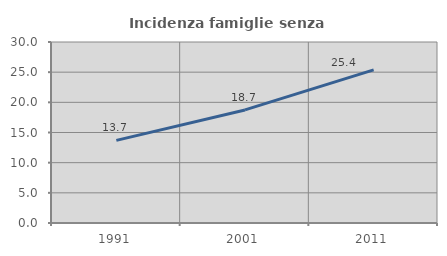
| Category | Incidenza famiglie senza nuclei |
|---|---|
| 1991.0 | 13.693 |
| 2001.0 | 18.74 |
| 2011.0 | 25.38 |